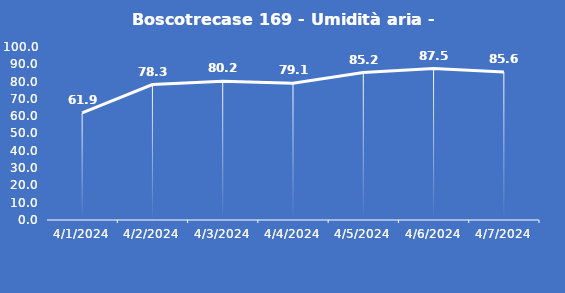
| Category | Boscotrecase 169 - Umidità aria - Grezzo (%) |
|---|---|
| 4/1/24 | 61.9 |
| 4/2/24 | 78.3 |
| 4/3/24 | 80.2 |
| 4/4/24 | 79.1 |
| 4/5/24 | 85.2 |
| 4/6/24 | 87.5 |
| 4/7/24 | 85.6 |